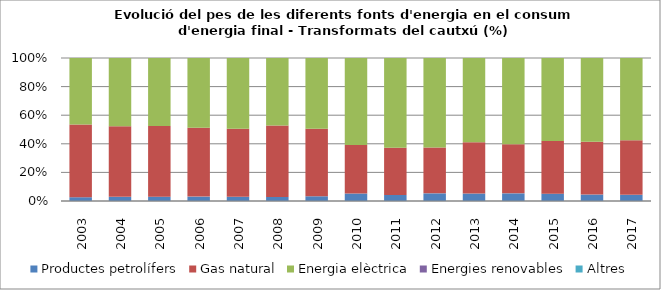
| Category | Productes petrolífers | Gas natural | Energia elèctrica | Energies renovables | Altres |
|---|---|---|---|---|---|
| 2003.0 | 1.1 | 21.2 | 19.4 | 0 | 0 |
| 2004.0 | 1.2 | 20.4 | 19.7 | 0 | 0 |
| 2005.0 | 1.2 | 19.7 | 19 | 0 | 0 |
| 2006.0 | 1.2 | 18.8 | 19.1 | 0 | 0 |
| 2007.0 | 1.1 | 17.8 | 18.5 | 0 | 0 |
| 2008.0 | 0.9 | 16 | 15.1 | 0 | 0 |
| 2009.0 | 0.7 | 10 | 10.5 | 0 | 0 |
| 2010.0 | 0.8 | 5.2 | 9.3 | 0 | 0 |
| 2011.0 | 0.6 | 4.7 | 8.9 | 0 | 0 |
| 2012.0 | 0.7 | 4.2 | 8.2 | 0 | 0 |
| 2013.0 | 0.7 | 4.8 | 7.9 | 0 | 0 |
| 2014.0 | 0.7 | 4.5 | 7.9 | 0 | 0 |
| 2015.0 | 0.7 | 5 | 7.9 | 0 | 0 |
| 2016.0 | 0.6 | 4.9 | 7.8 | 0 | 0 |
| 2017.0 | 0.6 | 5.3 | 8 | 0 | 0 |